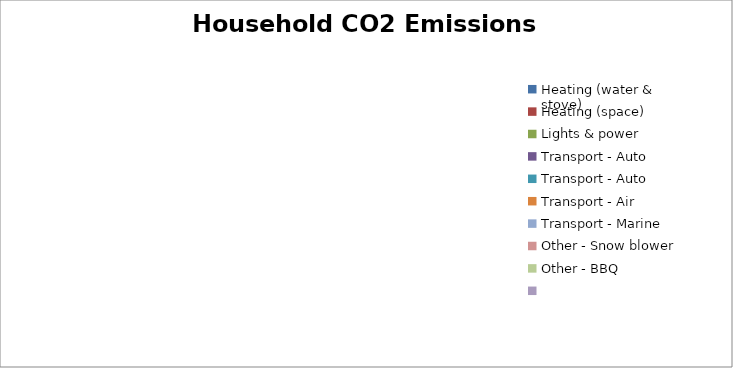
| Category | Series 0 |
|---|---|
| Heating (water & stove) | 0 |
| Heating (space) | 0 |
| Lights & power | 0 |
| Transport - Auto  | 0 |
| Transport - Auto  | 0 |
| Transport - Air | 0 |
| Transport - Marine | 0 |
| Other - Snow blower | 0 |
| Other - BBQ | 0 |